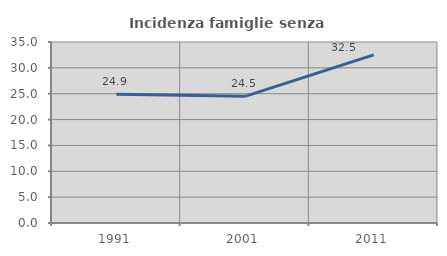
| Category | Incidenza famiglie senza nuclei |
|---|---|
| 1991.0 | 24.903 |
| 2001.0 | 24.497 |
| 2011.0 | 32.515 |